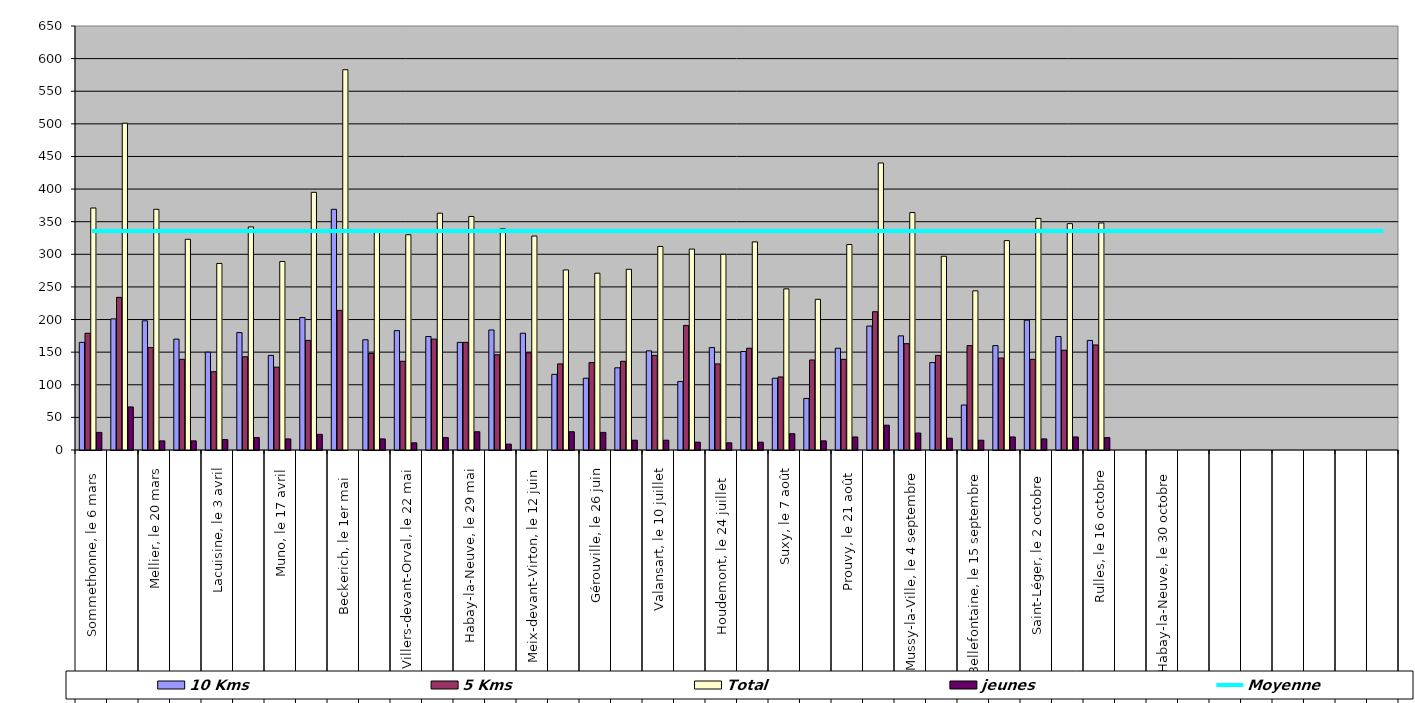
| Category | 10 Kms | 5 Kms | Total | jeunes |
|---|---|---|---|---|
| 0 | 165 | 179 | 371 | 27 |
| 1 | 201 | 234 | 501 | 66 |
| 2 | 198 | 157 | 369 | 14 |
| 3 | 170 | 139 | 323 | 14 |
| 4 | 150 | 120 | 286 | 16 |
| 5 | 180 | 143 | 342 | 19 |
| 6 | 145 | 127 | 289 | 17 |
| 7 | 203 | 168 | 395 | 24 |
| 8 | 369 | 214 | 583 | 0 |
| 9 | 169 | 148 | 334 | 17 |
| 10 | 183 | 136 | 330 | 11 |
| 11 | 174 | 170 | 363 | 19 |
| 12 | 165 | 165 | 358 | 28 |
| 13 | 184 | 146 | 339 | 9 |
| 14 | 179 | 149 | 328 | 0 |
| 15 | 116 | 132 | 276 | 28 |
| 16 | 110 | 134 | 271 | 27 |
| 17 | 126 | 136 | 277 | 15 |
| 18 | 152 | 145 | 312 | 15 |
| 19 | 105 | 191 | 308 | 12 |
| 20 | 157 | 132 | 300 | 11 |
| 21 | 151 | 156 | 319 | 12 |
| 22 | 110 | 112 | 247 | 25 |
| 23 | 79 | 138 | 231 | 14 |
| 24 | 156 | 139 | 315 | 20 |
| 25 | 190 | 212 | 440 | 38 |
| 26 | 175 | 163 | 364 | 26 |
| 27 | 134 | 145 | 297 | 18 |
| 28 | 69 | 160 | 244 | 15 |
| 29 | 160 | 141 | 321 | 20 |
| 30 | 199 | 139 | 355 | 17 |
| 31 | 174 | 153 | 347 | 20 |
| 32 | 168 | 161 | 348 | 19 |
| 33 | 0 | 0 | 0 | 0 |
| 34 | 0 | 0 | 0 | 0 |
| 35 | 0 | 0 | 0 | 0 |
| 36 | 0 | 0 | 0 | 0 |
| 37 | 0 | 0 | 0 | 0 |
| 38 | 0 | 0 | 0 | 0 |
| 39 | 0 | 0 | 0 | 0 |
| 40 | 0 | 0 | 0 | 0 |
| 41 | 0 | 0 | 0 | 0 |